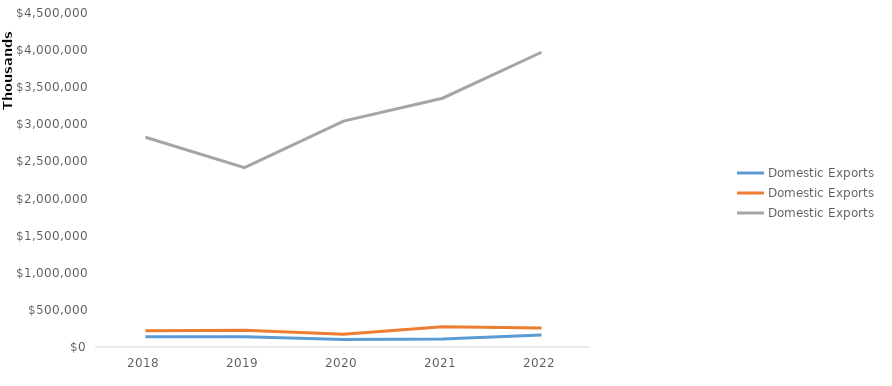
| Category | Cattle ranching and farming - Domestic Exports | Hog and pig farming - Domestic Exports | Oilseed and grain farming - Domestic Exports |
|---|---|---|---|
| 2018 | 136801112 | 218012340 | 2826679812 |
| 2019 | 138370795 | 225762735 | 2416633916 |
| 2020 | 99898731 | 173355592 | 3042741686 |
| 2021 | 108739777 | 272643222 | 3351845662 |
| 2022 | 162026550 | 255949637 | 3971213923 |